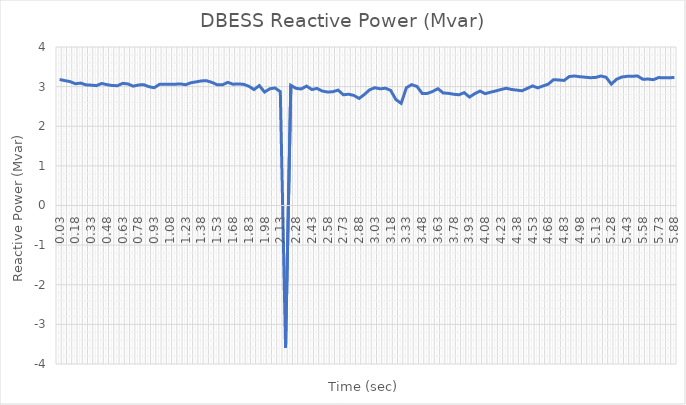
| Category | Reactive Power (Mvar) |
|---|---|
| 0.03 | 3.18 |
| 0.08 | 3.152 |
| 0.13 | 3.126 |
| 0.18 | 3.073 |
| 0.23 | 3.089 |
| 0.28 | 3.045 |
| 0.33 | 3.037 |
| 0.38 | 3.024 |
| 0.43 | 3.08 |
| 0.48 | 3.05 |
| 0.53 | 3.028 |
| 0.58 | 3.024 |
| 0.63 | 3.082 |
| 0.68 | 3.068 |
| 0.73 | 3.011 |
| 0.78 | 3.042 |
| 0.83 | 3.049 |
| 0.88 | 2.998 |
| 0.93 | 2.972 |
| 0.98 | 3.058 |
| 1.03 | 3.062 |
| 1.08 | 3.058 |
| 1.13 | 3.061 |
| 1.18 | 3.068 |
| 1.23 | 3.049 |
| 1.28 | 3.098 |
| 1.33 | 3.121 |
| 1.38 | 3.145 |
| 1.43 | 3.146 |
| 1.48 | 3.106 |
| 1.53 | 3.046 |
| 1.58 | 3.046 |
| 1.63 | 3.108 |
| 1.68 | 3.061 |
| 1.73 | 3.068 |
| 1.78 | 3.059 |
| 1.83 | 3.01 |
| 1.88 | 2.926 |
| 1.93 | 3.026 |
| 1.98 | 2.863 |
| 2.03 | 2.945 |
| 2.08 | 2.966 |
| 2.13 | 2.872 |
| 2.18 | -3.588 |
| 2.23 | 3.033 |
| 2.28 | 2.957 |
| 2.33 | 2.941 |
| 2.38 | 3.014 |
| 2.43 | 2.927 |
| 2.48 | 2.954 |
| 2.53 | 2.888 |
| 2.58 | 2.864 |
| 2.63 | 2.871 |
| 2.68 | 2.912 |
| 2.73 | 2.794 |
| 2.78 | 2.809 |
| 2.83 | 2.778 |
| 2.88 | 2.702 |
| 2.93 | 2.802 |
| 2.98 | 2.92 |
| 3.03 | 2.972 |
| 3.08 | 2.944 |
| 3.13 | 2.96 |
| 3.18 | 2.906 |
| 3.23 | 2.673 |
| 3.28 | 2.579 |
| 3.33 | 2.973 |
| 3.38 | 3.05 |
| 3.43 | 3.006 |
| 3.48 | 2.829 |
| 3.53 | 2.829 |
| 3.58 | 2.879 |
| 3.63 | 2.948 |
| 3.68 | 2.84 |
| 3.73 | 2.831 |
| 3.78 | 2.807 |
| 3.83 | 2.794 |
| 3.88 | 2.848 |
| 3.93 | 2.736 |
| 3.98 | 2.821 |
| 4.03 | 2.889 |
| 4.08 | 2.823 |
| 4.13 | 2.859 |
| 4.18 | 2.89 |
| 4.23 | 2.927 |
| 4.28 | 2.959 |
| 4.33 | 2.929 |
| 4.38 | 2.912 |
| 4.43 | 2.895 |
| 4.48 | 2.955 |
| 4.53 | 3.018 |
| 4.58 | 2.969 |
| 4.63 | 3.017 |
| 4.68 | 3.063 |
| 4.73 | 3.175 |
| 4.78 | 3.168 |
| 4.83 | 3.156 |
| 4.88 | 3.254 |
| 4.93 | 3.268 |
| 4.98 | 3.25 |
| 5.03 | 3.238 |
| 5.08 | 3.226 |
| 5.13 | 3.231 |
| 5.18 | 3.268 |
| 5.23 | 3.237 |
| 5.28 | 3.064 |
| 5.33 | 3.185 |
| 5.38 | 3.242 |
| 5.43 | 3.26 |
| 5.48 | 3.263 |
| 5.53 | 3.267 |
| 5.58 | 3.186 |
| 5.63 | 3.191 |
| 5.68 | 3.176 |
| 5.73 | 3.228 |
| 5.78 | 3.223 |
| 5.83 | 3.221 |
| 5.88 | 3.234 |